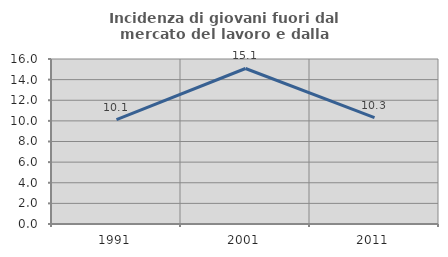
| Category | Incidenza di giovani fuori dal mercato del lavoro e dalla formazione  |
|---|---|
| 1991.0 | 10.127 |
| 2001.0 | 15.079 |
| 2011.0 | 10.309 |